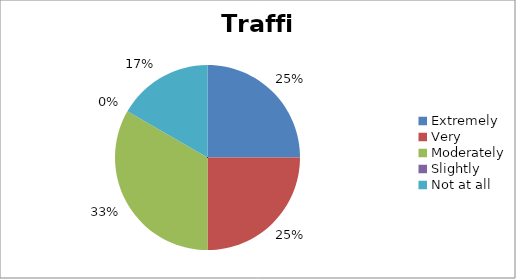
| Category | Traffic |
|---|---|
| Extremely | 3 |
| Very | 3 |
| Moderately | 4 |
| Slightly | 0 |
| Not at all | 2 |